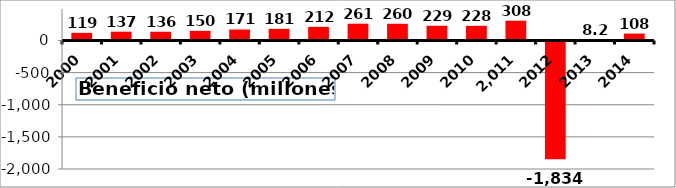
| Category | Beneficio neto |
|---|---|
| 2000.0 | 119 |
| 2001.0 | 137 |
| 2002.0 | 136 |
| 2003.0 | 150 |
| 2004.0 | 171 |
| 2005.0 | 181 |
| 2006.0 | 212 |
| 2007.0 | 261 |
| 2008.0 | 260 |
| 2009.0 | 229 |
| 2010.0 | 228 |
| 2011.0 | 308 |
| 2012.0 | -1834 |
| 2013.0 | 8.2 |
| 2014.0 | 108 |